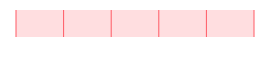
| Category | Onderhandelingspositie van kopers |
|---|---|
| 0 | 0 |